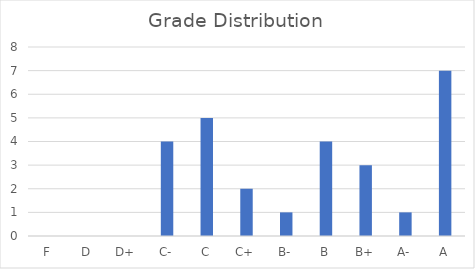
| Category | Series 0 |
|---|---|
| F | 0 |
| D | 0 |
| D+ | 0 |
| C- | 4 |
| C | 5 |
| C+ | 2 |
| B- | 1 |
| B | 4 |
| B+ | 3 |
| A- | 1 |
| A | 7 |